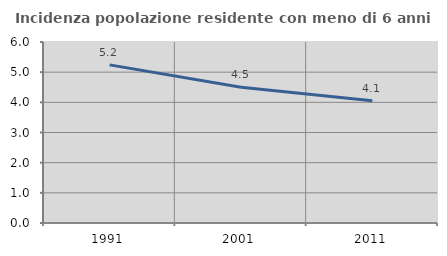
| Category | Incidenza popolazione residente con meno di 6 anni |
|---|---|
| 1991.0 | 5.242 |
| 2001.0 | 4.498 |
| 2011.0 | 4.051 |